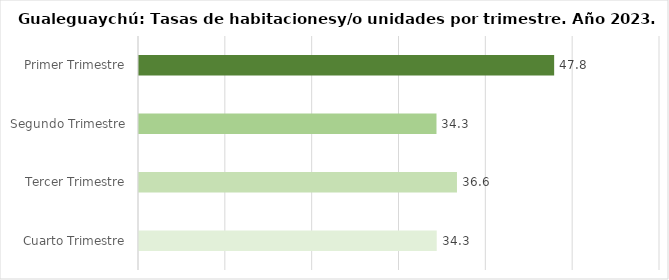
| Category | Series 0 |
|---|---|
| Primer Trimestre | 47.811 |
| Segundo Trimestre | 34.259 |
| Tercer Trimestre | 36.619 |
| Cuarto Trimestre | 34.287 |